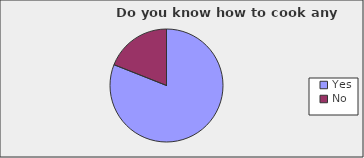
| Category | Series 0 |
|---|---|
| Yes | 0.81 |
| No | 0.19 |